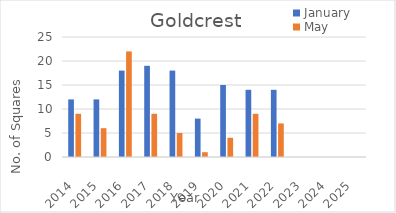
| Category | January | May |
|---|---|---|
| 2014.0 | 12 | 9 |
| 2015.0 | 12 | 6 |
| 2016.0 | 18 | 22 |
| 2017.0 | 19 | 9 |
| 2018.0 | 18 | 5 |
| 2019.0 | 8 | 1 |
| 2020.0 | 15 | 4 |
| 2021.0 | 14 | 9 |
| 2022.0 | 14 | 7 |
| 2023.0 | 0 | 0 |
| 2024.0 | 0 | 0 |
| 2025.0 | 0 | 0 |